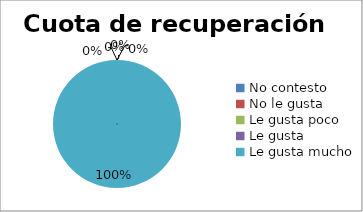
| Category | Series 0 |
|---|---|
| No contesto | 0 |
| No le gusta | 0 |
| Le gusta poco | 0 |
| Le gusta | 0 |
| Le gusta mucho | 5 |